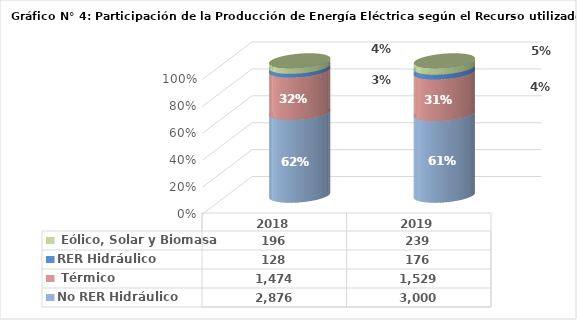
| Category | No RER Hidráulico | No RER Térmico | RER Hidráulico | RER Eólico, Solar y Biomasa |
|---|---|---|---|---|
| 2018.0 | 2875.811 | 1473.883 | 127.87 | 196.158 |
| 2019.0 | 3000.29 | 1528.668 | 176.437 | 239.187 |